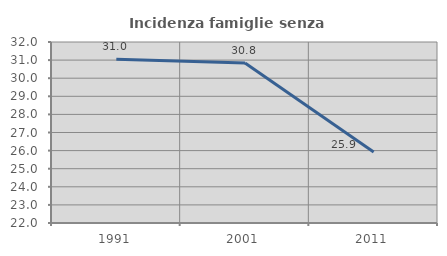
| Category | Incidenza famiglie senza nuclei |
|---|---|
| 1991.0 | 31.047 |
| 2001.0 | 30.841 |
| 2011.0 | 25.926 |